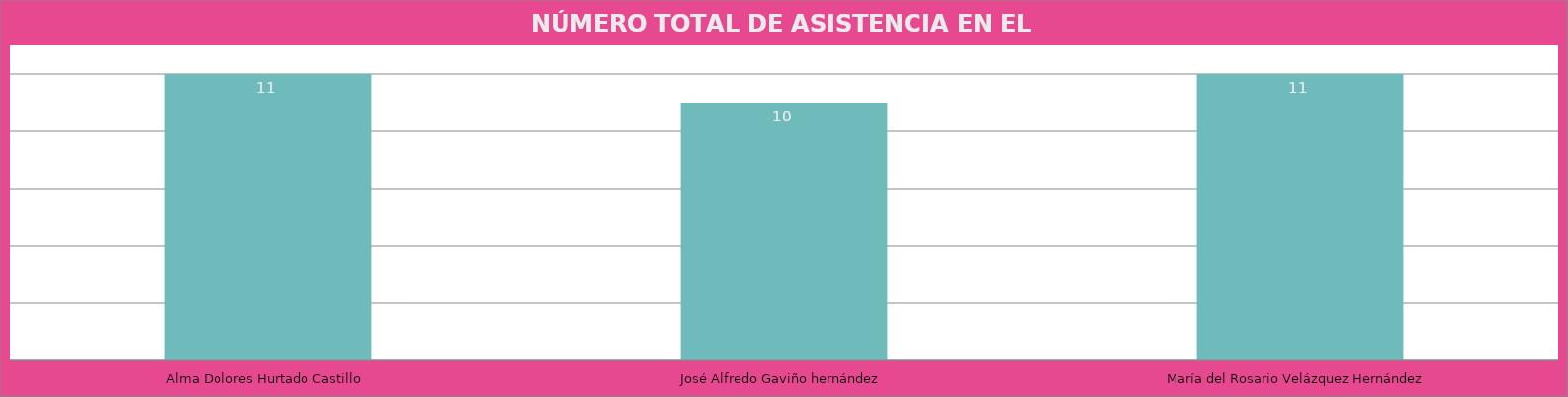
| Category | Alma Dolores Hurtado Castillo |
|---|---|
| Alma Dolores Hurtado Castillo | 11 |
| José Alfredo Gaviño hernández | 10 |
| María del Rosario Velázquez Hernández | 11 |